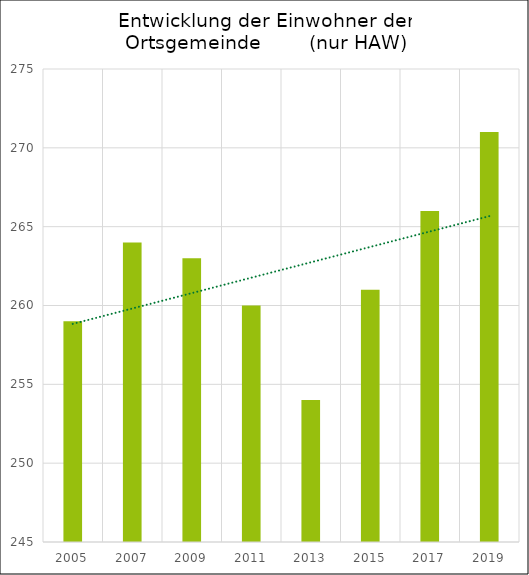
| Category | Series 0 |
|---|---|
| 2005.0 | 259 |
| 2007.0 | 264 |
| 2009.0 | 263 |
| 2011.0 | 260 |
| 2013.0 | 254 |
| 2015.0 | 261 |
| 2017.0 | 266 |
| 2019.0 | 271 |